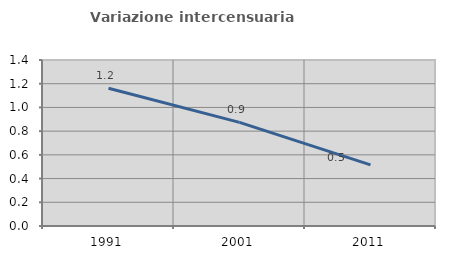
| Category | Variazione intercensuaria annua |
|---|---|
| 1991.0 | 1.161 |
| 2001.0 | 0.874 |
| 2011.0 | 0.515 |